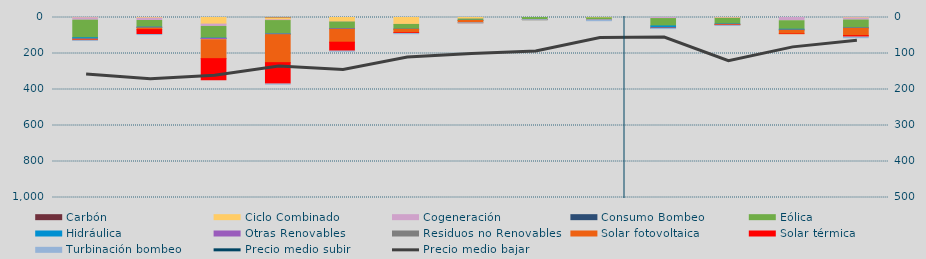
| Category | Carbón | Ciclo Combinado | Cogeneración | Consumo Bombeo | Eólica | Hidráulica | Otras Renovables | Residuos no Renovables | Solar fotovoltaica | Solar térmica | Turbinación bombeo |
|---|---|---|---|---|---|---|---|---|---|---|---|
| 0 | 0 | 1230 | 13598.7 | 0 | 97489.7 | 5402.7 | 1813.8 | 1013 | 3586.5 | 2430.1 | 317.4 |
| 1 | 0 | 3090.6 | 13474.7 | 0 | 37149 | 1123.6 | 3207.9 | 675 | 8550.9 | 27054.6 | 431 |
| 2 | 0 | 36734.9 | 12855.2 | 0 | 65071.5 | 1518 | 6583 | 675 | 105142.4 | 122842 | 0 |
| 3 | 2096 | 11203.8 | 3780.2 | 0 | 74938.3 | 359.9 | 3182.9 | 0 | 155352.2 | 119223.3 | 200 |
| 4 | 0 | 23416.9 | 1799.3 | 0 | 36710.1 | 169.9 | 2791.7 | 130.2 | 72190.6 | 49997.5 | 140 |
| 5 | 0 | 38168.9 | 488.4 | 0 | 26054.9 | 21.9 | 466.4 | 0 | 19329.3 | 4158.9 | 1184.2 |
| 6 | 0 | 7357.7 | 1214.8 | 0 | 7240.9 | 133.6 | 501.7 | 0 | 12900.5 | 0 | 280 |
| 7 | 0 | 0 | 195.2 | 0 | 11271.7 | 31.8 | 43.5 | 0 | 327.2 | 72.2 | 190.9 |
| 8 | 0 | 1594 | 466.5 | 0 | 10201.8 | 124.4 | 68.4 | 0 | 144.3 | 50.3 | 5089.6 |
| 9 | 0 | 0 | 5902.2 | 0 | 40924.6 | 10096 | 2210.8 | 541.2 | 397.2 | 861 | 700 |
| 10 | 0 | 2180.9 | 2937.8 | 0 | 30839.8 | 1899.6 | 565.6 | 0 | 1849.2 | 2802 | 1100 |
| 11 | 0 | 0 | 18046.2 | 0 | 47159 | 4513.5 | 523.7 | 0 | 19900.6 | 2658.1 | 0 |
| 12 | 0 | 2280 | 11810.8 | 0 | 43127.1 | 1164.1 | 1123.7 | 0 | 41530.2 | 8077.8 | 3040.7 |